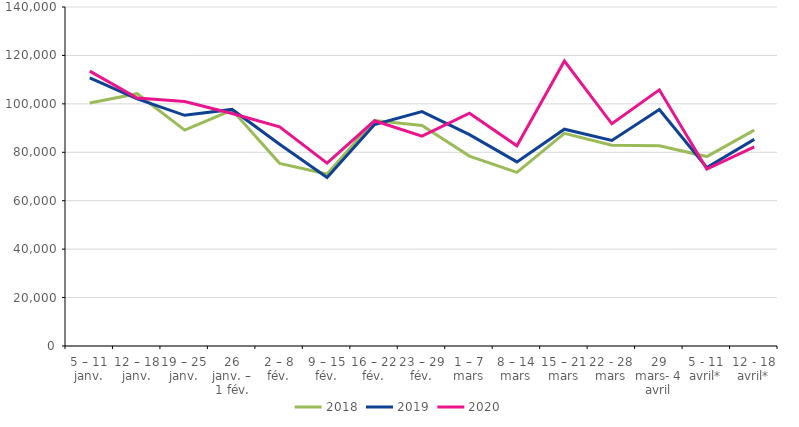
| Category | 2018 | 2019 | 2020 |
|---|---|---|---|
| 5 – 11 janv. | 100330 | 110701 | 113506 |
| 12 – 18 janv. | 104190 | 102045 | 102407 |
| 19 – 25 janv. | 89142 | 95260 | 100966 |
| 26 janv. – 1 fév. | 97441 | 97699 | 96042 |
| 2 – 8 fév. | 75434 | 83347 | 90495 |
| 9 – 15 fév. | 71031 | 69559 | 75523 |
| 16 – 22 fév. | 93102 | 91428 | 93003 |
| 23 – 29 fév. | 91065 | 96774 | 86699 |
| 1 – 7 mars | 78415 | 87314 | 96119 |
| 8 – 14 mars | 71697 | 76021 | 82690 |
| 15 – 21 mars | 87845 | 89536 | 117673 |
| 22 - 28 mars | 82895 | 84912 | 91764 |
| 29 mars- 4 avril | 82654 | 97699 | 105802 |
| 5 - 11 avril* | 78244 | 73699 | 73061 |
| 12 - 18 avril* | 89129 | 85348 | 82195 |